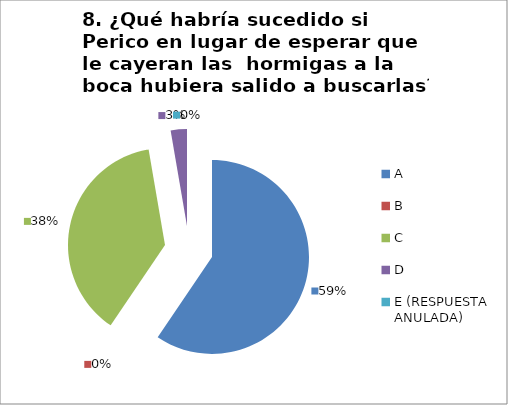
| Category | CANTIDAD DE RESPUESTAS PREGUNTA (8) | PORCENTAJE |
|---|---|---|
| A | 22 | 0.595 |
| B | 0 | 0 |
| C | 14 | 0.378 |
| D | 1 | 0.027 |
| E (RESPUESTA ANULADA) | 0 | 0 |